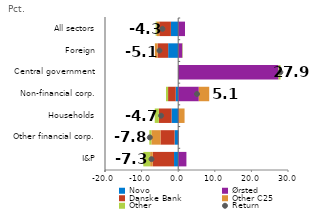
| Category | Novo | Ørsted | Danske Bank | Other C25 | Other |
|---|---|---|---|---|---|
| I&P | -1.136 | 2.244 | -5.803 | -0.732 | -1.869 |
| Other financial corp. | -0.982 | 0.133 | -3.86 | -2.495 | -0.553 |
| Households | -1.812 | 0.182 | -3.473 | 1.554 | -1.121 |
| Non-financial corp. | -0.67 | 5.628 | -2.096 | 2.847 | -0.575 |
| Central government | -0.009 | 27.42 | -0.019 | -0.005 | 0.523 |
| Foreign | -2.739 | 1.143 | -2.899 | -0.729 | 0.112 |
| All sectors | -1.997 | 1.855 | -3.172 | -0.706 | -0.277 |